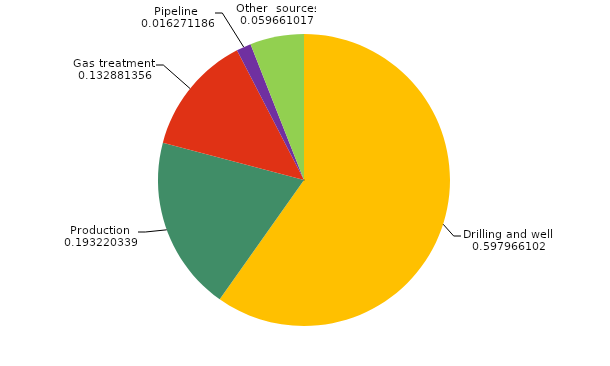
| Category | Series 0 |
|---|---|
| Drilling and well  | 88.2 |
| Production  | 28.5 |
| Gas treatment  | 19.6 |
| Pipeline  | 2.4 |
| Other  sources | 8.8 |